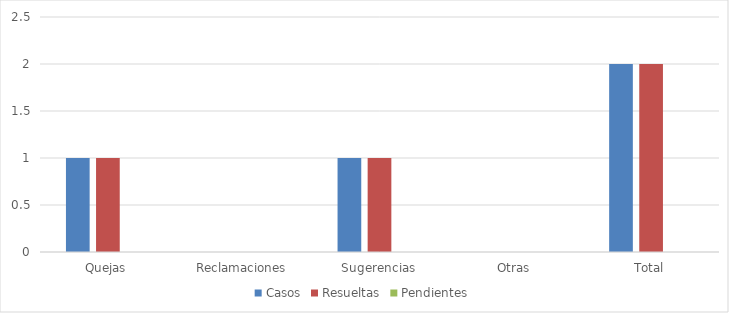
| Category | Casos | Resueltas | Pendientes |
|---|---|---|---|
| Quejas | 1 | 1 | 0 |
| Reclamaciones | 0 | 0 | 0 |
| Sugerencias | 1 | 1 | 0 |
| Otras | 0 | 0 | 0 |
| Total | 2 | 2 | 0 |